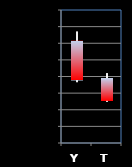
| Category | Series 0 | Series 1 | Series 2 | Series 3 |
|---|---|---|---|---|
| Y | 14007 | 14035 | 13883 | 13889 |
| T | 13895 | 13910 | 13824 | 13827 |